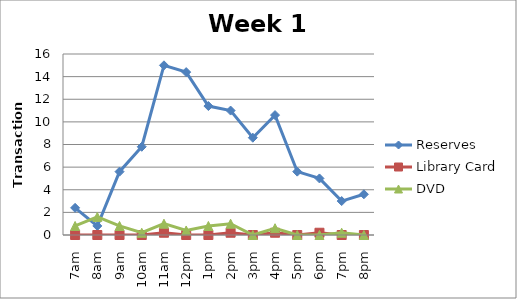
| Category | Reserves | Library Card | DVD |
|---|---|---|---|
| 7am | 2.4 | 0 | 0.8 |
| 8am | 0.8 | 0 | 1.6 |
| 9am | 5.6 | 0 | 0.8 |
| 10am | 7.8 | 0 | 0.2 |
| 11am | 15 | 0.2 | 1 |
| 12pm | 14.4 | 0 | 0.4 |
| 1pm | 11.4 | 0 | 0.8 |
| 2pm | 11 | 0.2 | 1 |
| 3pm | 8.6 | 0 | 0 |
| 4pm | 10.6 | 0.2 | 0.6 |
| 5pm | 5.6 | 0 | 0 |
| 6pm | 5 | 0.2 | 0 |
| 7pm | 3 | 0 | 0.2 |
| 8pm | 3.6 | 0 | 0 |